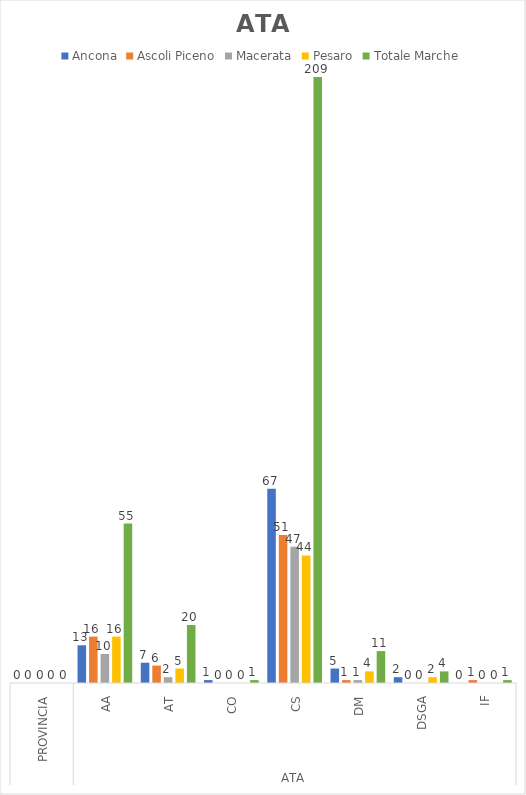
| Category | Ancona | Ascoli Piceno | Macerata | Pesaro | Totale Marche |
|---|---|---|---|---|---|
| 0 | 0 | 0 | 0 | 0 | 0 |
| 1 | 13 | 16 | 10 | 16 | 55 |
| 2 | 7 | 6 | 2 | 5 | 20 |
| 3 | 1 | 0 | 0 | 0 | 1 |
| 4 | 67 | 51 | 47 | 44 | 209 |
| 5 | 5 | 1 | 1 | 4 | 11 |
| 6 | 2 | 0 | 0 | 2 | 4 |
| 7 | 0 | 1 | 0 | 0 | 1 |